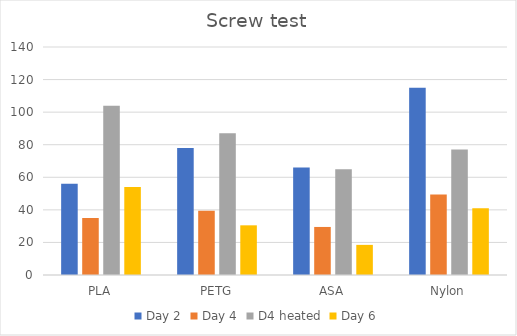
| Category | Day 2 | Day 4 | D4 heated | Day 6 |
|---|---|---|---|---|
| PLA | 56 | 35 | 104 | 54 |
| PETG | 78 | 39.5 | 87 | 30.5 |
| ASA | 66 | 29.5 | 65 | 18.5 |
| Nylon | 115 | 49.5 | 77 | 41 |